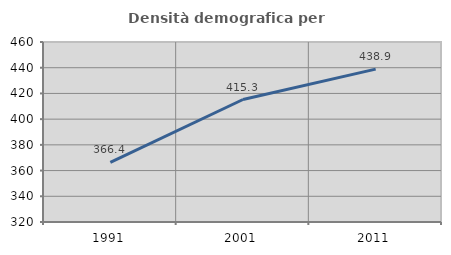
| Category | Densità demografica |
|---|---|
| 1991.0 | 366.442 |
| 2001.0 | 415.269 |
| 2011.0 | 438.921 |